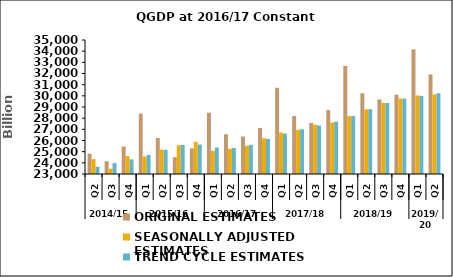
| Category | ORIGINAL ESTIMATES | SEASONALLY ADJUSTED ESTIMATES | TREND CYCLE ESTIMATES |
|---|---|---|---|
| 0 | 24825.71 | 24326.376 | 23642.805 |
| 1 | 24150.673 | 23474.093 | 23967.449 |
| 2 | 25458.923 | 24596.568 | 24309.596 |
| 3 | 28411.246 | 24558.526 | 24699.838 |
| 4 | 26228.783 | 25168.866 | 25170.982 |
| 5 | 24503.419 | 25566.939 | 25600.702 |
| 6 | 25303.519 | 25881.739 | 25635.364 |
| 7 | 28485.585 | 25074.759 | 25371.664 |
| 8 | 26556.754 | 25257.79 | 25332.225 |
| 9 | 26359.326 | 25522.161 | 25614.358 |
| 10 | 27116.376 | 26194.119 | 26138.607 |
| 11 | 30721.31 | 26709.843 | 26617.999 |
| 12 | 28185.425 | 26946.729 | 27006.708 |
| 13 | 27567.514 | 27415.5 | 27344.701 |
| 14 | 28723.159 | 27610.722 | 27684.836 |
| 15 | 32675.491 | 28181.948 | 28185.858 |
| 16 | 30235.225 | 28798.164 | 28799.352 |
| 17 | 29683.739 | 29368.556 | 29354.072 |
| 18 | 30099.247 | 29756.946 | 29750.991 |
| 19 | 34158.391 | 30041.829 | 29990.432 |
| 20 | 31923.274 | 30123.943 | 30225.413 |